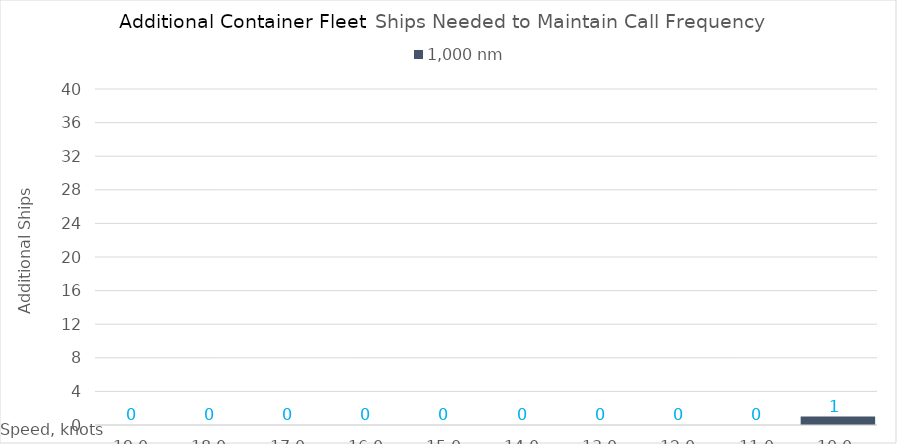
| Category | 1,000 |
|---|---|
| 19.0 | 0 |
| 18.0 | 0 |
| 17.0 | 0 |
| 16.0 | 0 |
| 15.0 | 0 |
| 14.0 | 0 |
| 13.0 | 0 |
| 12.0 | 0 |
| 11.0 | 0 |
| 10.0 | 1 |